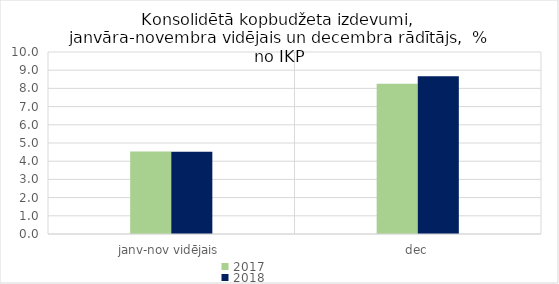
| Category | 2017 | 2018 |
|---|---|---|
| janv-nov vidējais | 4.538 | 4.523 |
| dec | 8.253 | 8.664 |